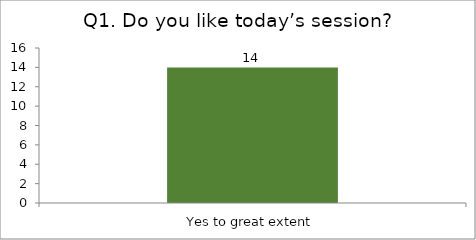
| Category | Q1. Do you like today’s session? |
|---|---|
| Yes to great extent | 14 |